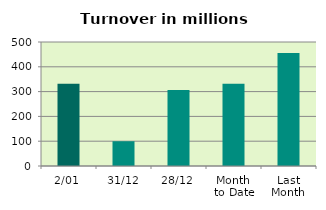
| Category | Series 0 |
|---|---|
| 2/01 | 331.28 |
| 31/12 | 99.85 |
| 28/12 | 306.617 |
| Month 
to Date | 331.28 |
| Last
Month | 455.699 |